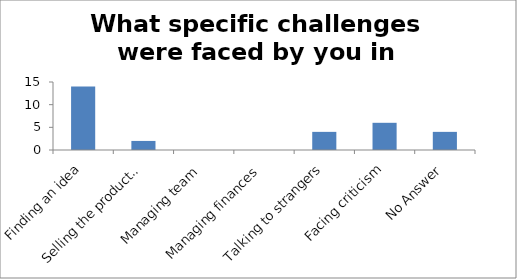
| Category | What specific challenges were faced by you in creating value? |
|---|---|
| Finding an idea | 14 |
| Selling the product/service | 2 |
| Managing team | 0 |
| Managing finances | 0 |
| Talking to strangers | 4 |
| Facing criticism | 6 |
| No Answer | 4 |